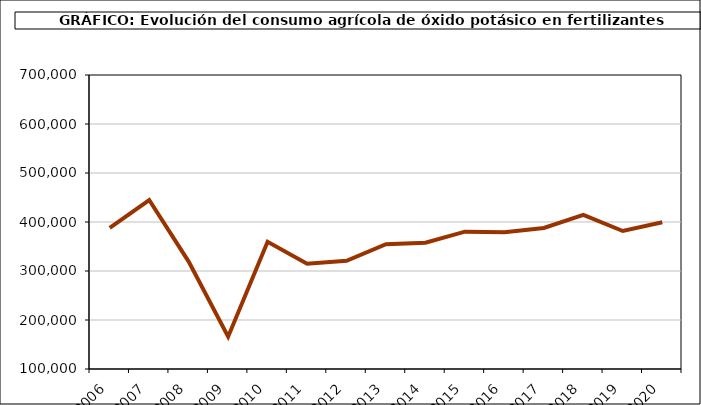
| Category | fertilizantes |
|---|---|
| 2006.0 | 388187 |
| 2007.0 | 444853 |
| 2008.0 | 319194 |
| 2009.0 | 166016 |
| 2010.0 | 359583 |
| 2011.0 | 314642 |
| 2012.0 | 320841 |
| 2013.0 | 354738 |
| 2014.0 | 357875 |
| 2015.0 | 380303 |
| 2016.0 | 379007 |
| 2017.0 | 387885 |
| 2018.0 | 414675 |
| 2019.0 | 381566 |
| 2020.0 | 399379 |